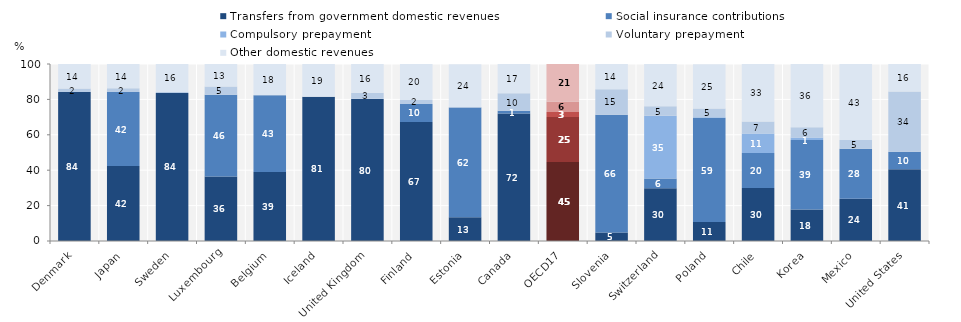
| Category | Transfers from government domestic revenues | Social insurance contributions | Compulsory prepayment | Voluntary prepayment | Other domestic revenues |
|---|---|---|---|---|---|
| Denmark | 84.143 | 0 | 0 | 2.068 | 13.789 |
| Japan | 42.411 | 41.707 | 0 | 2.196 | 13.686 |
| Sweden | 83.664 | 0 | 0 | 0.592 | 15.745 |
| Luxembourg | 36.468 | 46.207 | 0 | 4.662 | 12.657 |
| Belgium | 39.043 | 43.362 | 0 | 0.014 | 17.582 |
| Iceland | 81.475 | 0 | 0 | 0 | 18.525 |
| United Kingdom | 80.212 | 0 | 0.14 | 3.42 | 16.218 |
| Finland | 67.224 | 10.188 | 0 | 2.272 | 20.314 |
| Estonia | 13.488 | 61.874 | 0 | 0.292 | 24.141 |
| Canada | 72.101 | 1.449 | 0 | 9.893 | 16.557 |
| OECD17 | 44.566 | 25.459 | 2.852 | 5.99 | 21.11 |
| Slovenia | 4.811 | 66.485 | 0 | 14.503 | 14.201 |
| Switzerland | 29.782 | 5.51 | 35.435 | 5.383 | 23.89 |
| Poland | 10.698 | 58.779 | 0.408 | 5.039 | 24.886 |
| Chile | 29.927 | 19.753 | 11.101 | 6.668 | 32.55 |
| Korea | 17.801 | 39.324 | 1.406 | 5.791 | 35.678 |
| Mexico | 23.813 | 28.356 | 0 | 4.892 | 42.939 |
| United States | 40.555 | 9.801 | 0 | 34.137 | 15.507 |